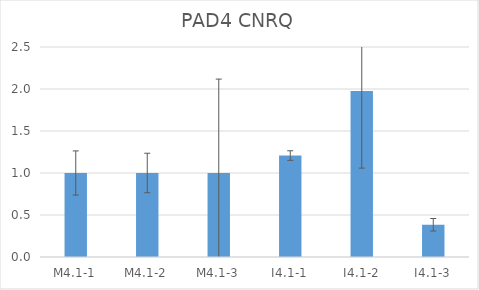
| Category | PAD4 CNRQ |
|---|---|
| M4.1-1 | 1 |
| M4.1-2 | 1 |
| M4.1-3 | 1 |
| I4.1-1 | 1.208 |
| I4.1-2 | 1.975 |
| I4.1-3 | 0.384 |